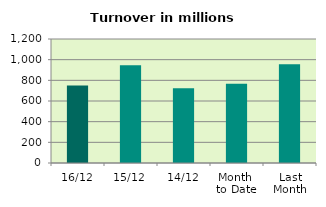
| Category | Series 0 |
|---|---|
| 16/12 | 750.3 |
| 15/12 | 946.358 |
| 14/12 | 723.449 |
| Month 
to Date | 766.71 |
| Last
Month | 954.978 |